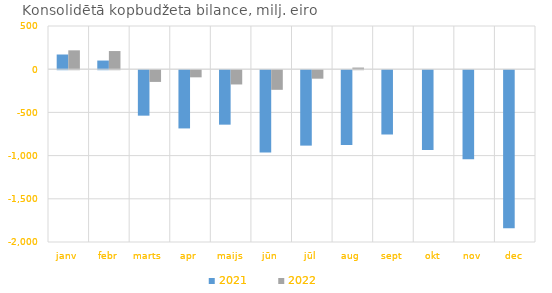
| Category | 2021 | 2022 |
|---|---|---|
| janv | 170157.398 | 218389.091 |
| febr | 100119.496 | 210185.141 |
| marts | -526188.27 | -135684.596 |
| apr | -673998.575 | -82545.759 |
| maijs | -630296.539 | -165099.527 |
| jūn | -953547.976 | -227076.221 |
| jūl | -872897.27 | -98216.206 |
| aug | -864679.341 | 19124.955 |
| sept | -744219.279 | 0 |
| okt | -924686.722 | 0 |
| nov | -1031801.177 | 0 |
| dec | -1828320.005 | 0 |